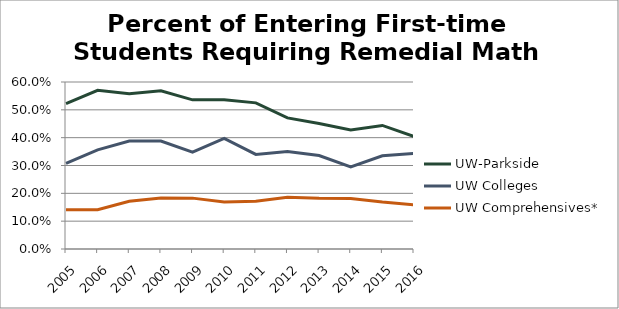
| Category | UW-Parkside | UW Colleges | UW Comprehensives* |
|---|---|---|---|
| 2005.0 | 0.522 | 0.308 | 0.141 |
| 2006.0 | 0.57 | 0.356 | 0.141 |
| 2007.0 | 0.558 | 0.388 | 0.171 |
| 2008.0 | 0.568 | 0.388 | 0.183 |
| 2009.0 | 0.536 | 0.348 | 0.183 |
| 2010.0 | 0.537 | 0.398 | 0.169 |
| 2011.0 | 0.525 | 0.34 | 0.171 |
| 2012.0 | 0.471 | 0.35 | 0.186 |
| 2013.0 | 0.451 | 0.336 | 0.182 |
| 2014.0 | 0.428 | 0.295 | 0.182 |
| 2015.0 | 0.444 | 0.335 | 0.169 |
| 2016.0 | 0.404 | 0.343 | 0.159 |